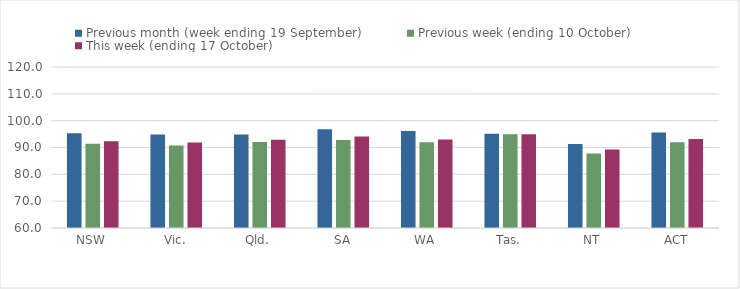
| Category | Previous month (week ending 19 September) | Previous week (ending 10 October) | This week (ending 17 October) |
|---|---|---|---|
| NSW | 95.3 | 91.36 | 92.37 |
| Vic. | 94.8 | 90.75 | 91.83 |
| Qld. | 94.85 | 92.03 | 92.91 |
| SA | 96.79 | 92.76 | 94.11 |
| WA | 96.14 | 92 | 92.95 |
| Tas. | 95.15 | 94.96 | 94.96 |
| NT | 91.35 | 87.81 | 89.29 |
| ACT | 95.56 | 91.96 | 93.15 |